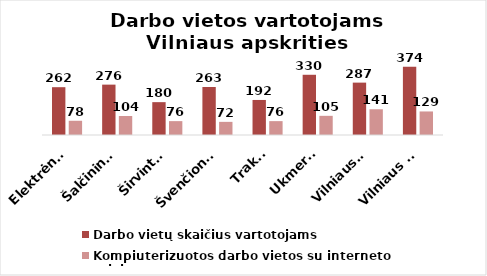
| Category | Darbo vietų skaičius vartotojams | Kompiuterizuotos darbo vietos su interneto prieiga |
|---|---|---|
| Elektrėnai | 262 | 78 |
| Šalčininkai | 276 | 104 |
| Širvintos | 180 | 76 |
| Švenčionys | 263 | 72 |
| Trakai | 192 | 76 |
| Ukmergė | 330 | 105 |
| Vilniaus r. | 287 | 141 |
| Vilniaus m. | 374 | 129 |